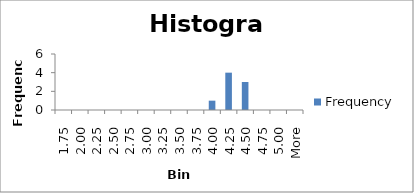
| Category | Frequency |
|---|---|
| 1.75 | 0 |
| 2.00 | 0 |
| 2.25 | 0 |
| 2.50 | 0 |
| 2.75 | 0 |
| 3.00 | 0 |
| 3.25 | 0 |
| 3.50 | 0 |
| 3.75 | 0 |
| 4.00 | 1 |
| 4.25 | 4 |
| 4.50 | 3 |
| 4.75 | 0 |
| 5.00 | 0 |
| More | 0 |